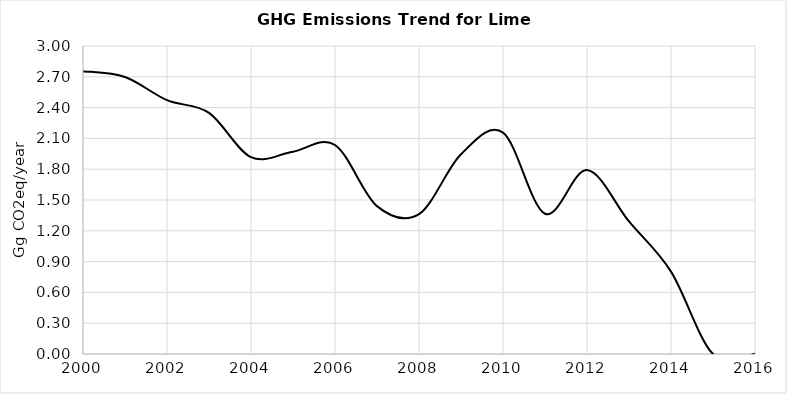
| Category | Series 0 |
|---|---|
| 2000.0 | 2.755 |
| 2001.0 | 2.698 |
| 2002.0 | 2.472 |
| 2003.0 | 2.349 |
| 2004.0 | 1.917 |
| 2005.0 | 1.971 |
| 2006.0 | 2.035 |
| 2007.0 | 1.44 |
| 2008.0 | 1.362 |
| 2009.0 | 1.946 |
| 2010.0 | 2.156 |
| 2011.0 | 1.366 |
| 2012.0 | 1.792 |
| 2013.0 | 1.291 |
| 2014.0 | 0.802 |
| 2015.0 | 0 |
| 2016.0 | 0 |